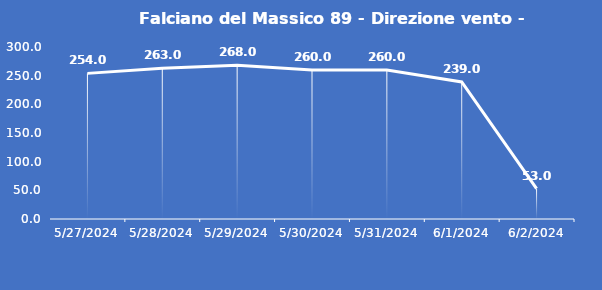
| Category | Falciano del Massico 89 - Direzione vento - Grezzo (°N) |
|---|---|
| 5/27/24 | 254 |
| 5/28/24 | 263 |
| 5/29/24 | 268 |
| 5/30/24 | 260 |
| 5/31/24 | 260 |
| 6/1/24 | 239 |
| 6/2/24 | 53 |